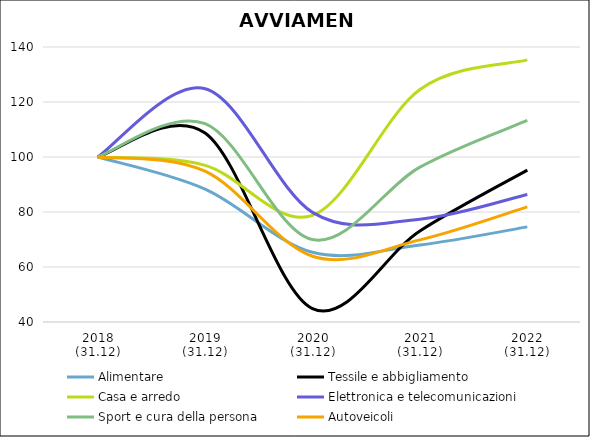
| Category | Alimentare | Tessile e abbigliamento | Casa e arredo | Elettronica e telecomunicazioni | Sport e cura della persona | Autoveicoli |
|---|---|---|---|---|---|---|
| 2018
(31.12) | 100 | 100 | 100 | 100 | 100 | 100 |
| 2019
(31.12) | 88.32 | 108.727 | 96.97 | 124.832 | 112.107 | 94.836 |
| 2020
(31.12) | 65.341 | 44.867 | 78.788 | 79.866 | 69.969 | 63.928 |
| 2021
(31.12) | 68.026 | 73.101 | 124.545 | 77.405 | 96.305 | 69.875 |
| 2022
(31.12) | 74.588 | 95.226 | 135.303 | 86.353 | 113.286 | 81.847 |